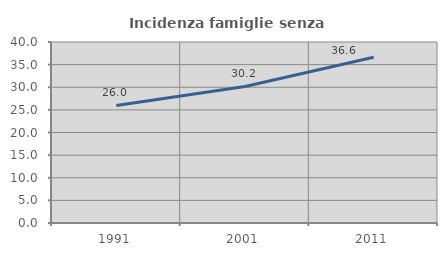
| Category | Incidenza famiglie senza nuclei |
|---|---|
| 1991.0 | 25.973 |
| 2001.0 | 30.176 |
| 2011.0 | 36.647 |